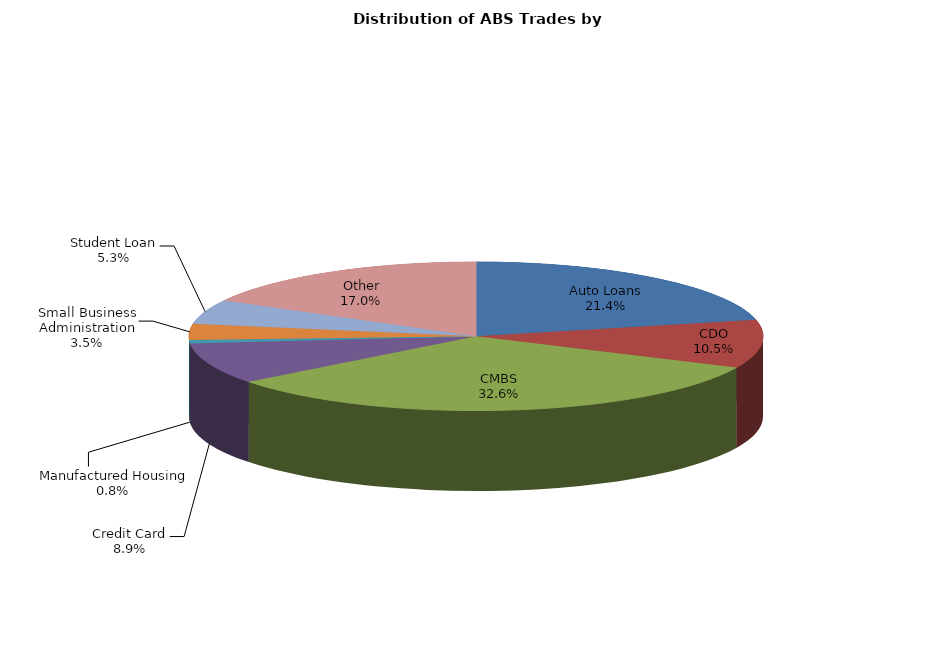
| Category | Series 0 |
|---|---|
| Auto Loans | 157.5 |
| CDO | 77.226 |
| CMBS | 239.853 |
| Credit Card | 65.496 |
| Manufactured Housing | 5.762 |
| Small Business Administration | 25.651 |
| Student Loan | 39.06 |
| Other | 124.865 |